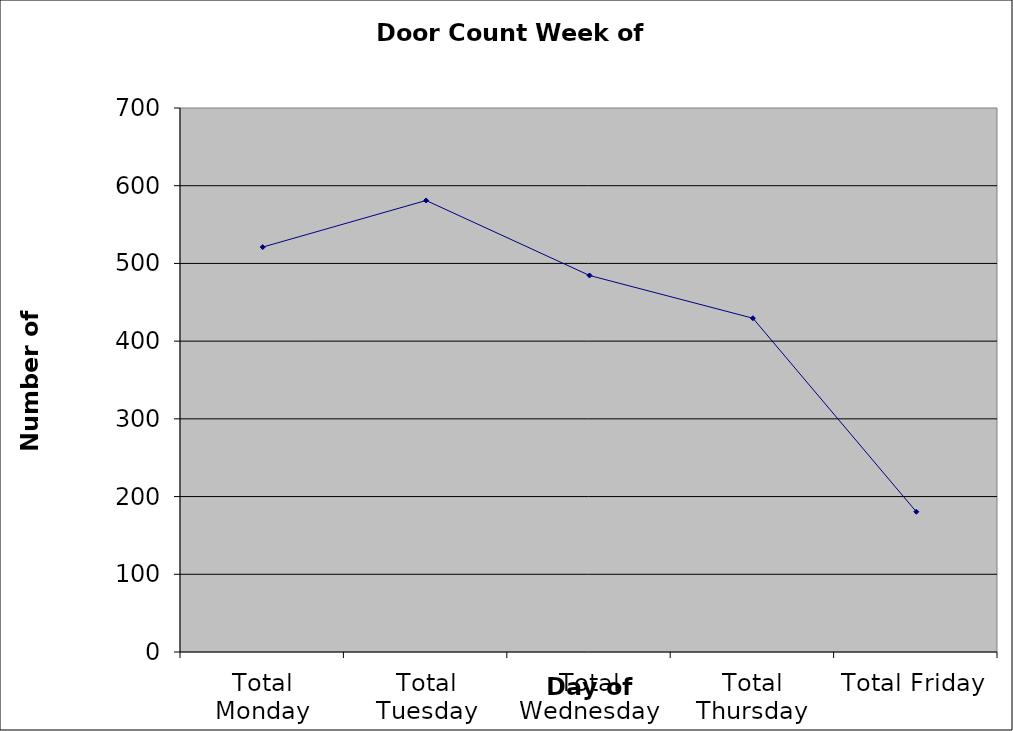
| Category | Series 0 |
|---|---|
| Total Monday | 521 |
| Total Tuesday | 581 |
| Total Wednesday | 484.5 |
| Total Thursday | 429.5 |
| Total Friday | 180.5 |